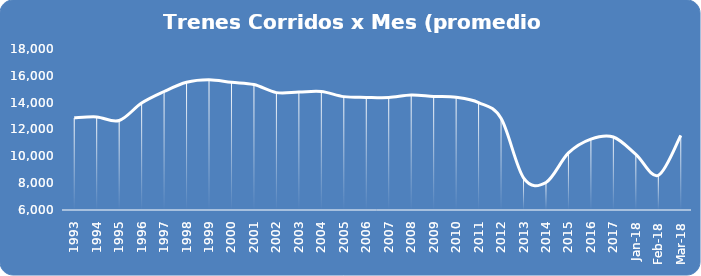
| Category | Series 0 |
|---|---|
| 1993.0 | 12869.333 |
| 1994.0 | 12940.333 |
| 1995.0 | 12668.75 |
| 1996.0 | 13973.667 |
| 1997.0 | 14832.917 |
| 1998.0 | 15523.333 |
| 1999.0 | 15713 |
| 2000.0 | 15515.083 |
| 2001.0 | 15350.083 |
| 2002.0 | 14749 |
| 2003.0 | 14792.417 |
| 2004.0 | 14832.75 |
| 2005.0 | 14450.25 |
| 2006.0 | 14394.333 |
| 2007.0 | 14382.333 |
| 2008.0 | 14571.333 |
| 2009.0 | 14466.75 |
| 2010.0 | 14406 |
| 2011.0 | 14009.75 |
| 2012.0 | 12831.083 |
| 2013.0 | 8399.583 |
| 2014.0 | 8052.667 |
| 2015.0 | 10252.917 |
| 2016.0 | 11287 |
| 2017.0 | 11441.583 |
| 43101.0 | 10147 |
| 43132.0 | 8587 |
| 43160.0 | 11559 |